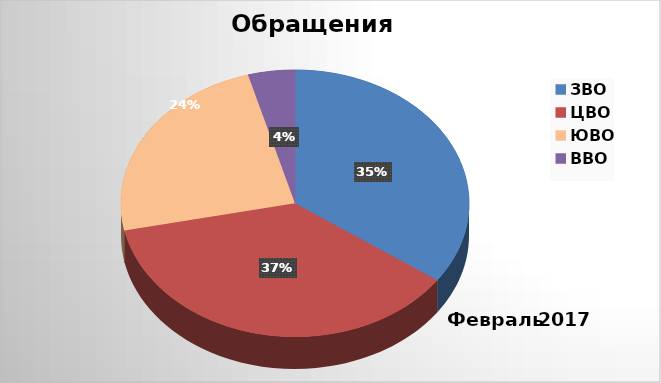
| Category | Series 0 |
|---|---|
| ЗВО | 16 |
| ЦВО | 17 |
| ЮВО | 11 |
| ВВО | 2 |